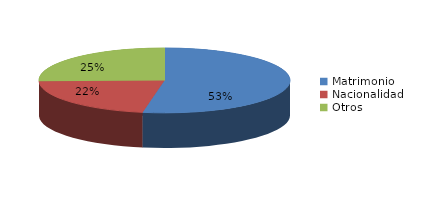
| Category | Series 0 |
|---|---|
| Matrimonio | 362 |
| Nacionalidad | 150 |
| Otros | 174 |